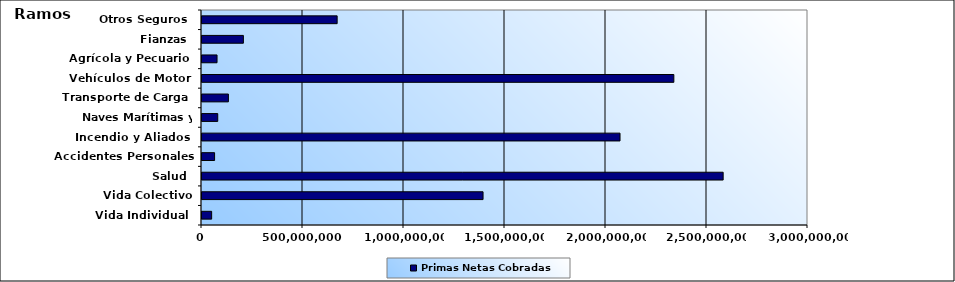
| Category | Primas Netas Cobradas |
|---|---|
| Vida Individual  | 47776612.94 |
| Vida Colectivo | 1391344508.46 |
| Salud  | 2579999111.42 |
| Accidentes Personales | 62302968.55 |
| Incendio y Aliados  | 2069390211.26 |
| Naves Marítimas y Aéreas  | 77935057.67 |
| Transporte de Carga  | 130661643.38 |
| Vehículos de Motor  | 2335898365.09 |
| Agrícola y Pecuario  | 74448724.5 |
| Fianzas  | 204879953.94 |
| Otros Seguros  | 669074129.33 |